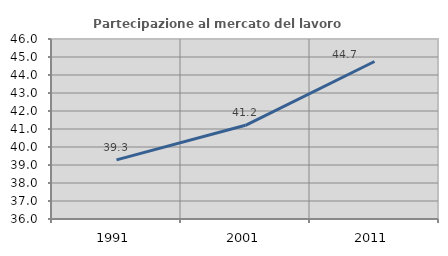
| Category | Partecipazione al mercato del lavoro  femminile |
|---|---|
| 1991.0 | 39.286 |
| 2001.0 | 41.206 |
| 2011.0 | 44.749 |